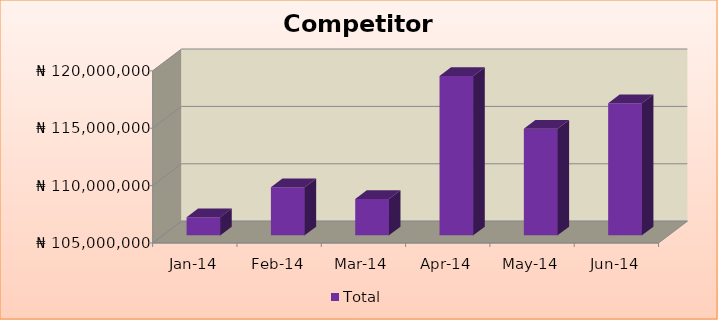
| Category | Total |
|---|---|
| 2014-01-01 | 106588000 |
| 2014-02-01 | 109198000 |
| 2014-03-01 | 108163000 |
| 2014-04-01 | 118880000 |
| 2014-05-01 | 114281000 |
| 2014-06-01 | 116516000 |